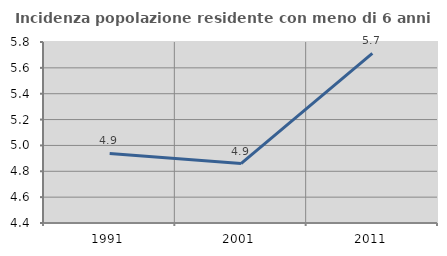
| Category | Incidenza popolazione residente con meno di 6 anni |
|---|---|
| 1991.0 | 4.938 |
| 2001.0 | 4.86 |
| 2011.0 | 5.712 |